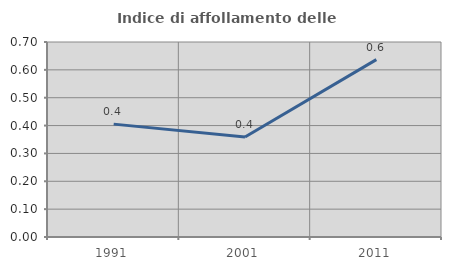
| Category | Indice di affollamento delle abitazioni  |
|---|---|
| 1991.0 | 0.405 |
| 2001.0 | 0.359 |
| 2011.0 | 0.637 |